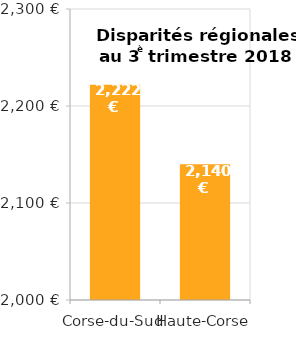
| Category | 2018 T3 |
|---|---|
| Corse-du-Sud | 2222 |
| Haute-Corse | 2140 |